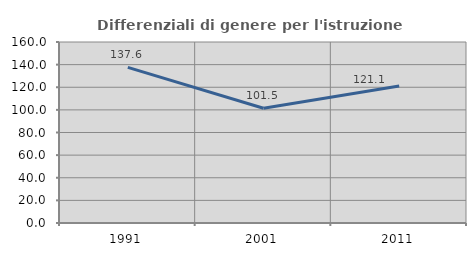
| Category | Differenziali di genere per l'istruzione superiore |
|---|---|
| 1991.0 | 137.58 |
| 2001.0 | 101.474 |
| 2011.0 | 121.06 |